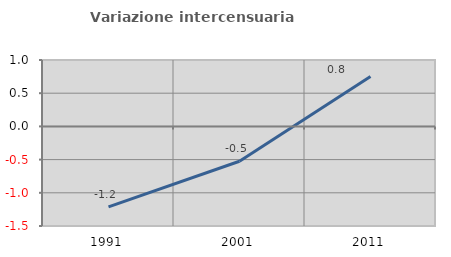
| Category | Variazione intercensuaria annua |
|---|---|
| 1991.0 | -1.213 |
| 2001.0 | -0.525 |
| 2011.0 | 0.751 |